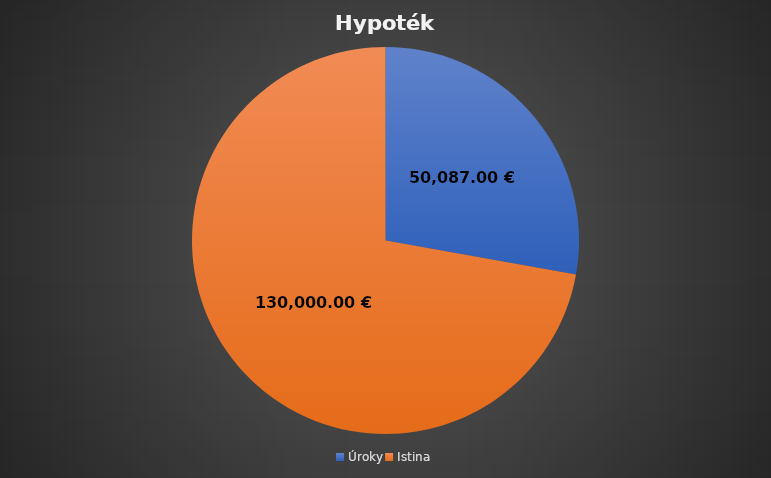
| Category | Series 0 |
|---|---|
| Úroky | 50087.004 |
| Istina | 130000 |